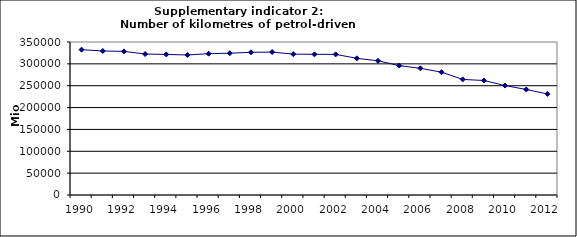
| Category | Number of kilometres of petrol-driven passenger cars, Mio km |
|---|---|
| 1990 | 332471.069 |
| 1991 | 329422.898 |
| 1992 | 328579.664 |
| 1993 | 322466.879 |
| 1994 | 321532.074 |
| 1995 | 320341.376 |
| 1996 | 323279.298 |
| 1997 | 324390.675 |
| 1998 | 326435.248 |
| 1999 | 326924.554 |
| 2000 | 322257.733 |
| 2001 | 321827.529 |
| 2002 | 321720.46 |
| 2003 | 312646.746 |
| 2004 | 306990.437 |
| 2005 | 296055.649 |
| 2006 | 289874.392 |
| 2007 | 280945.855 |
| 2008 | 264367.997 |
| 2009 | 261939.912 |
| 2010 | 250324.52 |
| 2011 | 241393.466 |
| 2012 | 231217.579 |